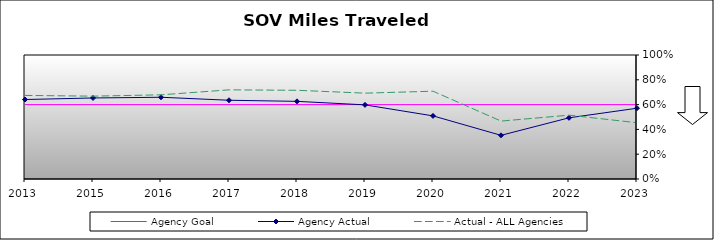
| Category | Agency Goal | Agency Actual | Actual - ALL Agencies |
|---|---|---|---|
| 2013.0 | 0.6 | 0.641 | 0.674 |
| 2015.0 | 0.6 | 0.653 | 0.668 |
| 2016.0 | 0.6 | 0.659 | 0.679 |
| 2017.0 | 0.6 | 0.635 | 0.719 |
| 2018.0 | 0.6 | 0.626 | 0.715 |
| 2019.0 | 0.6 | 0.598 | 0.692 |
| 2020.0 | 0.6 | 0.509 | 0.708 |
| 2021.0 | 0.6 | 0.352 | 0.467 |
| 2022.0 | 0.6 | 0.493 | 0.515 |
| 2023.0 | 0.6 | 0.571 | 0.454 |